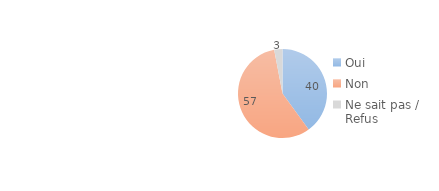
| Category | Series 0 |
|---|---|
| Oui | 40 |
| Non | 57 |
| Ne sait pas / Refus | 3 |